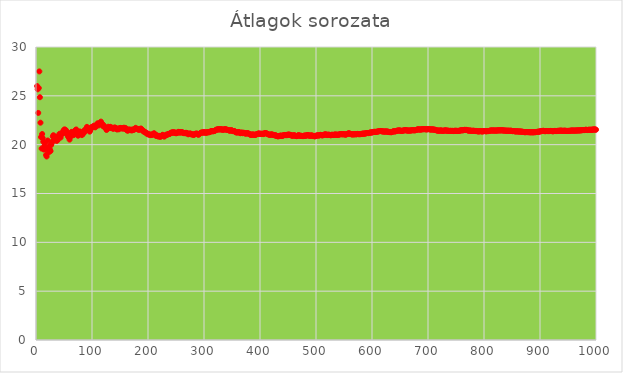
| Category | Series 0 |
|---|---|
| 1.0 | 36 |
| 2.0 | 26 |
| 3.0 | 25.667 |
| 4.0 | 23.25 |
| 5.0 | 25.8 |
| 6.0 | 27.5 |
| 7.0 | 24.857 |
| 8.0 | 22.25 |
| 9.0 | 20.778 |
| 10.0 | 19.6 |
| 11.0 | 21.091 |
| 12.0 | 20.667 |
| 13.0 | 20.308 |
| 14.0 | 19.5 |
| 15.0 | 19.867 |
| 16.0 | 20.188 |
| 17.0 | 19.529 |
| 18.0 | 18.944 |
| 19.0 | 18.789 |
| 20.0 | 19.65 |
| 21.0 | 20.429 |
| 22.0 | 19.682 |
| 23.0 | 19.217 |
| 24.0 | 19.917 |
| 25.0 | 19.48 |
| 26.0 | 19.346 |
| 27.0 | 19.963 |
| 28.0 | 20.143 |
| 29.0 | 20.31 |
| 30.0 | 20.833 |
| 31.0 | 20.968 |
| 32.0 | 20.438 |
| 33.0 | 20.576 |
| 34.0 | 20.706 |
| 35.0 | 20.829 |
| 36.0 | 20.5 |
| 37.0 | 20.378 |
| 38.0 | 20.789 |
| 39.0 | 20.487 |
| 40.0 | 20.875 |
| 41.0 | 20.756 |
| 42.0 | 21.119 |
| 43.0 | 21 |
| 44.0 | 20.727 |
| 45.0 | 21.067 |
| 46.0 | 21.152 |
| 47.0 | 21.234 |
| 48.0 | 21.125 |
| 49.0 | 21.429 |
| 50.0 | 21.5 |
| 51.0 | 21.569 |
| 52.0 | 21.231 |
| 53.0 | 21.509 |
| 54.0 | 21.407 |
| 55.0 | 21.309 |
| 56.0 | 21.089 |
| 57.0 | 20.877 |
| 58.0 | 20.793 |
| 59.0 | 20.712 |
| 60.0 | 20.517 |
| 61.0 | 20.77 |
| 62.0 | 21.016 |
| 63.0 | 21.254 |
| 64.0 | 21.312 |
| 65.0 | 21.123 |
| 66.0 | 21.045 |
| 67.0 | 20.97 |
| 68.0 | 21.029 |
| 69.0 | 21.246 |
| 70.0 | 21.457 |
| 71.0 | 21.507 |
| 72.0 | 21.556 |
| 73.0 | 21.315 |
| 74.0 | 21.081 |
| 75.0 | 20.92 |
| 76.0 | 20.974 |
| 77.0 | 21.169 |
| 78.0 | 21.359 |
| 79.0 | 21.291 |
| 80.0 | 21.138 |
| 81.0 | 21.185 |
| 82.0 | 20.976 |
| 83.0 | 21.157 |
| 84.0 | 21.095 |
| 85.0 | 21.271 |
| 86.0 | 21.442 |
| 87.0 | 21.483 |
| 88.0 | 21.341 |
| 89.0 | 21.506 |
| 90.0 | 21.667 |
| 91.0 | 21.824 |
| 92.0 | 21.63 |
| 93.0 | 21.495 |
| 94.0 | 21.649 |
| 95.0 | 21.463 |
| 96.0 | 21.333 |
| 97.0 | 21.485 |
| 98.0 | 21.633 |
| 99.0 | 21.778 |
| 100.0 | 21.81 |
| 101.0 | 21.842 |
| 102.0 | 21.873 |
| 103.0 | 21.816 |
| 104.0 | 21.952 |
| 105.0 | 21.829 |
| 106.0 | 21.774 |
| 107.0 | 21.907 |
| 108.0 | 21.935 |
| 109.0 | 22.064 |
| 110.0 | 22.191 |
| 111.0 | 22.135 |
| 112.0 | 21.973 |
| 113.0 | 22.097 |
| 114.0 | 22.123 |
| 115.0 | 22.243 |
| 116.0 | 22.362 |
| 117.0 | 22.205 |
| 118.0 | 22.153 |
| 119.0 | 21.975 |
| 120.0 | 21.867 |
| 121.0 | 21.983 |
| 122.0 | 21.836 |
| 123.0 | 21.789 |
| 124.0 | 21.742 |
| 125.0 | 21.64 |
| 126.0 | 21.5 |
| 127.0 | 21.614 |
| 128.0 | 21.727 |
| 129.0 | 21.837 |
| 130.0 | 21.738 |
| 131.0 | 21.695 |
| 132.0 | 21.803 |
| 133.0 | 21.827 |
| 134.0 | 21.731 |
| 135.0 | 21.689 |
| 136.0 | 21.713 |
| 137.0 | 21.737 |
| 138.0 | 21.609 |
| 139.0 | 21.712 |
| 140.0 | 21.736 |
| 141.0 | 21.759 |
| 142.0 | 21.718 |
| 143.0 | 21.678 |
| 144.0 | 21.59 |
| 145.0 | 21.552 |
| 146.0 | 21.651 |
| 147.0 | 21.612 |
| 148.0 | 21.574 |
| 149.0 | 21.671 |
| 150.0 | 21.693 |
| 151.0 | 21.715 |
| 152.0 | 21.678 |
| 153.0 | 21.699 |
| 154.0 | 21.662 |
| 155.0 | 21.684 |
| 156.0 | 21.647 |
| 157.0 | 21.739 |
| 158.0 | 21.658 |
| 159.0 | 21.623 |
| 160.0 | 21.712 |
| 161.0 | 21.602 |
| 162.0 | 21.494 |
| 163.0 | 21.46 |
| 164.0 | 21.427 |
| 165.0 | 21.515 |
| 166.0 | 21.536 |
| 167.0 | 21.557 |
| 168.0 | 21.482 |
| 169.0 | 21.503 |
| 170.0 | 21.524 |
| 171.0 | 21.45 |
| 172.0 | 21.535 |
| 173.0 | 21.555 |
| 174.0 | 21.523 |
| 175.0 | 21.543 |
| 176.0 | 21.562 |
| 177.0 | 21.644 |
| 178.0 | 21.725 |
| 179.0 | 21.609 |
| 180.0 | 21.628 |
| 181.0 | 21.597 |
| 182.0 | 21.615 |
| 183.0 | 21.519 |
| 184.0 | 21.538 |
| 185.0 | 21.557 |
| 186.0 | 21.575 |
| 187.0 | 21.652 |
| 188.0 | 21.622 |
| 189.0 | 21.529 |
| 190.0 | 21.5 |
| 191.0 | 21.408 |
| 192.0 | 21.344 |
| 193.0 | 21.363 |
| 194.0 | 21.299 |
| 195.0 | 21.272 |
| 196.0 | 21.245 |
| 197.0 | 21.157 |
| 198.0 | 21.131 |
| 199.0 | 21.151 |
| 200.0 | 21.09 |
| 201.0 | 21.03 |
| 202.0 | 21.05 |
| 203.0 | 21.025 |
| 204.0 | 21 |
| 205.0 | 20.976 |
| 206.0 | 21.049 |
| 207.0 | 21.024 |
| 208.0 | 21 |
| 209.0 | 21.072 |
| 210.0 | 21.143 |
| 211.0 | 21.161 |
| 212.0 | 21.104 |
| 213.0 | 21.009 |
| 214.0 | 20.916 |
| 215.0 | 20.893 |
| 216.0 | 20.963 |
| 217.0 | 20.908 |
| 218.0 | 20.853 |
| 219.0 | 20.831 |
| 220.0 | 20.9 |
| 221.0 | 20.846 |
| 222.0 | 20.793 |
| 223.0 | 20.861 |
| 224.0 | 20.879 |
| 225.0 | 20.947 |
| 226.0 | 21.013 |
| 227.0 | 20.96 |
| 228.0 | 20.873 |
| 229.0 | 20.821 |
| 230.0 | 20.887 |
| 231.0 | 20.952 |
| 232.0 | 20.97 |
| 233.0 | 21.034 |
| 234.0 | 21.013 |
| 235.0 | 21.03 |
| 236.0 | 21.093 |
| 237.0 | 21.11 |
| 238.0 | 21.088 |
| 239.0 | 21.105 |
| 240.0 | 21.167 |
| 241.0 | 21.228 |
| 242.0 | 21.207 |
| 243.0 | 21.267 |
| 244.0 | 21.217 |
| 245.0 | 21.278 |
| 246.0 | 21.228 |
| 247.0 | 21.243 |
| 248.0 | 21.258 |
| 249.0 | 21.189 |
| 250.0 | 21.168 |
| 251.0 | 21.183 |
| 252.0 | 21.198 |
| 253.0 | 21.257 |
| 254.0 | 21.315 |
| 255.0 | 21.267 |
| 256.0 | 21.246 |
| 257.0 | 21.304 |
| 258.0 | 21.225 |
| 259.0 | 21.282 |
| 260.0 | 21.296 |
| 261.0 | 21.249 |
| 262.0 | 21.263 |
| 263.0 | 21.198 |
| 264.0 | 21.178 |
| 265.0 | 21.192 |
| 266.0 | 21.207 |
| 267.0 | 21.161 |
| 268.0 | 21.216 |
| 269.0 | 21.171 |
| 270.0 | 21.185 |
| 271.0 | 21.122 |
| 272.0 | 21.059 |
| 273.0 | 21.114 |
| 274.0 | 21.095 |
| 275.0 | 21.149 |
| 276.0 | 21.13 |
| 277.0 | 21.058 |
| 278.0 | 21.072 |
| 279.0 | 21.054 |
| 280.0 | 21.036 |
| 281.0 | 21.018 |
| 282.0 | 21 |
| 283.0 | 21.053 |
| 284.0 | 21.106 |
| 285.0 | 21.119 |
| 286.0 | 21.101 |
| 287.0 | 21.153 |
| 288.0 | 21.094 |
| 289.0 | 21.052 |
| 290.0 | 21.01 |
| 291.0 | 21.062 |
| 292.0 | 21.113 |
| 293.0 | 21.164 |
| 294.0 | 21.214 |
| 295.0 | 21.227 |
| 296.0 | 21.24 |
| 297.0 | 21.253 |
| 298.0 | 21.235 |
| 299.0 | 21.284 |
| 300.0 | 21.227 |
| 301.0 | 21.276 |
| 302.0 | 21.258 |
| 303.0 | 21.218 |
| 304.0 | 21.23 |
| 305.0 | 21.243 |
| 306.0 | 21.255 |
| 307.0 | 21.303 |
| 308.0 | 21.263 |
| 309.0 | 21.275 |
| 310.0 | 21.287 |
| 311.0 | 21.334 |
| 312.0 | 21.346 |
| 313.0 | 21.393 |
| 314.0 | 21.376 |
| 315.0 | 21.387 |
| 316.0 | 21.37 |
| 317.0 | 21.382 |
| 318.0 | 21.393 |
| 319.0 | 21.404 |
| 320.0 | 21.45 |
| 321.0 | 21.495 |
| 322.0 | 21.54 |
| 323.0 | 21.523 |
| 324.0 | 21.568 |
| 325.0 | 21.578 |
| 326.0 | 21.561 |
| 327.0 | 21.572 |
| 328.0 | 21.555 |
| 329.0 | 21.599 |
| 330.0 | 21.561 |
| 331.0 | 21.571 |
| 332.0 | 21.554 |
| 333.0 | 21.538 |
| 334.0 | 21.521 |
| 335.0 | 21.564 |
| 336.0 | 21.548 |
| 337.0 | 21.558 |
| 338.0 | 21.601 |
| 339.0 | 21.563 |
| 340.0 | 21.526 |
| 341.0 | 21.537 |
| 342.0 | 21.52 |
| 343.0 | 21.504 |
| 344.0 | 21.488 |
| 345.0 | 21.438 |
| 346.0 | 21.448 |
| 347.0 | 21.432 |
| 348.0 | 21.474 |
| 349.0 | 21.484 |
| 350.0 | 21.449 |
| 351.0 | 21.413 |
| 352.0 | 21.378 |
| 353.0 | 21.388 |
| 354.0 | 21.398 |
| 355.0 | 21.363 |
| 356.0 | 21.315 |
| 357.0 | 21.266 |
| 358.0 | 21.251 |
| 359.0 | 21.262 |
| 360.0 | 21.247 |
| 361.0 | 21.288 |
| 362.0 | 21.298 |
| 363.0 | 21.251 |
| 364.0 | 21.217 |
| 365.0 | 21.17 |
| 366.0 | 21.21 |
| 367.0 | 21.251 |
| 368.0 | 21.217 |
| 369.0 | 21.171 |
| 370.0 | 21.211 |
| 371.0 | 21.221 |
| 372.0 | 21.188 |
| 373.0 | 21.155 |
| 374.0 | 21.142 |
| 375.0 | 21.152 |
| 376.0 | 21.138 |
| 377.0 | 21.178 |
| 378.0 | 21.188 |
| 379.0 | 21.142 |
| 380.0 | 21.129 |
| 381.0 | 21.084 |
| 382.0 | 21.039 |
| 383.0 | 21.026 |
| 384.0 | 20.995 |
| 385.0 | 21.034 |
| 386.0 | 21.021 |
| 387.0 | 21.059 |
| 388.0 | 21.008 |
| 389.0 | 21.018 |
| 390.0 | 21.028 |
| 391.0 | 20.985 |
| 392.0 | 21.023 |
| 393.0 | 21.033 |
| 394.0 | 21.071 |
| 395.0 | 21.081 |
| 396.0 | 21.119 |
| 397.0 | 21.128 |
| 398.0 | 21.138 |
| 399.0 | 21.148 |
| 400.0 | 21.098 |
| 401.0 | 21.107 |
| 402.0 | 21.117 |
| 403.0 | 21.104 |
| 404.0 | 21.114 |
| 405.0 | 21.123 |
| 406.0 | 21.081 |
| 407.0 | 21.118 |
| 408.0 | 21.154 |
| 409.0 | 21.191 |
| 410.0 | 21.178 |
| 411.0 | 21.148 |
| 412.0 | 21.158 |
| 413.0 | 21.116 |
| 414.0 | 21.068 |
| 415.0 | 21.055 |
| 416.0 | 21.043 |
| 417.0 | 21.002 |
| 418.0 | 21.012 |
| 419.0 | 21.021 |
| 420.0 | 21.057 |
| 421.0 | 21.045 |
| 422.0 | 21.017 |
| 423.0 | 21.026 |
| 424.0 | 20.986 |
| 425.0 | 20.974 |
| 426.0 | 20.962 |
| 427.0 | 20.934 |
| 428.0 | 20.97 |
| 429.0 | 20.923 |
| 430.0 | 20.884 |
| 431.0 | 20.872 |
| 432.0 | 20.845 |
| 433.0 | 20.88 |
| 434.0 | 20.869 |
| 435.0 | 20.903 |
| 436.0 | 20.913 |
| 437.0 | 20.922 |
| 438.0 | 20.932 |
| 439.0 | 20.893 |
| 440.0 | 20.902 |
| 441.0 | 20.937 |
| 442.0 | 20.971 |
| 443.0 | 20.959 |
| 444.0 | 20.993 |
| 445.0 | 20.982 |
| 446.0 | 20.971 |
| 447.0 | 21.004 |
| 448.0 | 20.967 |
| 449.0 | 21 |
| 450.0 | 21.033 |
| 451.0 | 21.022 |
| 452.0 | 21.031 |
| 453.0 | 21.004 |
| 454.0 | 21.013 |
| 455.0 | 20.987 |
| 456.0 | 20.95 |
| 457.0 | 20.912 |
| 458.0 | 20.921 |
| 459.0 | 20.93 |
| 460.0 | 20.963 |
| 461.0 | 20.926 |
| 462.0 | 20.959 |
| 463.0 | 20.922 |
| 464.0 | 20.897 |
| 465.0 | 20.871 |
| 466.0 | 20.88 |
| 467.0 | 20.912 |
| 468.0 | 20.944 |
| 469.0 | 20.977 |
| 470.0 | 20.94 |
| 471.0 | 20.915 |
| 472.0 | 20.905 |
| 473.0 | 20.913 |
| 474.0 | 20.903 |
| 475.0 | 20.893 |
| 476.0 | 20.882 |
| 477.0 | 20.872 |
| 478.0 | 20.904 |
| 479.0 | 20.912 |
| 480.0 | 20.944 |
| 481.0 | 20.919 |
| 482.0 | 20.909 |
| 483.0 | 20.94 |
| 484.0 | 20.971 |
| 485.0 | 20.961 |
| 486.0 | 20.992 |
| 487.0 | 20.951 |
| 488.0 | 20.926 |
| 489.0 | 20.892 |
| 490.0 | 20.922 |
| 491.0 | 20.953 |
| 492.0 | 20.943 |
| 493.0 | 20.933 |
| 494.0 | 20.909 |
| 495.0 | 20.875 |
| 496.0 | 20.905 |
| 497.0 | 20.871 |
| 498.0 | 20.847 |
| 499.0 | 20.878 |
| 500.0 | 20.908 |
| 501.0 | 20.938 |
| 502.0 | 20.928 |
| 503.0 | 20.958 |
| 504.0 | 20.948 |
| 505.0 | 20.939 |
| 506.0 | 20.947 |
| 507.0 | 20.976 |
| 508.0 | 21.006 |
| 509.0 | 20.982 |
| 510.0 | 20.973 |
| 511.0 | 20.949 |
| 512.0 | 20.957 |
| 513.0 | 20.986 |
| 514.0 | 21.016 |
| 515.0 | 21.023 |
| 516.0 | 21.052 |
| 517.0 | 21.06 |
| 518.0 | 21.037 |
| 519.0 | 21.004 |
| 520.0 | 20.981 |
| 521.0 | 21.01 |
| 522.0 | 21.038 |
| 523.0 | 21 |
| 524.0 | 21.008 |
| 525.0 | 20.985 |
| 526.0 | 20.962 |
| 527.0 | 20.97 |
| 528.0 | 20.998 |
| 529.0 | 21.026 |
| 530.0 | 20.994 |
| 531.0 | 20.985 |
| 532.0 | 21.013 |
| 533.0 | 21.021 |
| 534.0 | 21.049 |
| 535.0 | 21.026 |
| 536.0 | 21.017 |
| 537.0 | 21.007 |
| 538.0 | 21.035 |
| 539.0 | 21.013 |
| 540.0 | 21.004 |
| 541.0 | 21.031 |
| 542.0 | 21.059 |
| 543.0 | 21.066 |
| 544.0 | 21.074 |
| 545.0 | 21.064 |
| 546.0 | 21.092 |
| 547.0 | 21.06 |
| 548.0 | 21.068 |
| 549.0 | 21.058 |
| 550.0 | 21.065 |
| 551.0 | 21.073 |
| 552.0 | 21.042 |
| 553.0 | 21.02 |
| 554.0 | 21.047 |
| 555.0 | 21.074 |
| 556.0 | 21.101 |
| 557.0 | 21.127 |
| 558.0 | 21.154 |
| 559.0 | 21.161 |
| 560.0 | 21.139 |
| 561.0 | 21.109 |
| 562.0 | 21.087 |
| 563.0 | 21.078 |
| 564.0 | 21.043 |
| 565.0 | 21.05 |
| 566.0 | 21.076 |
| 567.0 | 21.055 |
| 568.0 | 21.046 |
| 569.0 | 21.072 |
| 570.0 | 21.098 |
| 571.0 | 21.063 |
| 572.0 | 21.054 |
| 573.0 | 21.08 |
| 574.0 | 21.106 |
| 575.0 | 21.097 |
| 576.0 | 21.068 |
| 577.0 | 21.094 |
| 578.0 | 21.064 |
| 579.0 | 21.09 |
| 580.0 | 21.081 |
| 581.0 | 21.107 |
| 582.0 | 21.098 |
| 583.0 | 21.123 |
| 584.0 | 21.13 |
| 585.0 | 21.137 |
| 586.0 | 21.116 |
| 587.0 | 21.141 |
| 588.0 | 21.148 |
| 589.0 | 21.154 |
| 590.0 | 21.18 |
| 591.0 | 21.186 |
| 592.0 | 21.193 |
| 593.0 | 21.199 |
| 594.0 | 21.178 |
| 595.0 | 21.203 |
| 596.0 | 21.228 |
| 597.0 | 21.253 |
| 598.0 | 21.244 |
| 599.0 | 21.235 |
| 600.0 | 21.26 |
| 601.0 | 21.266 |
| 602.0 | 21.291 |
| 603.0 | 21.297 |
| 604.0 | 21.321 |
| 605.0 | 21.312 |
| 606.0 | 21.292 |
| 607.0 | 21.316 |
| 608.0 | 21.322 |
| 609.0 | 21.328 |
| 610.0 | 21.334 |
| 611.0 | 21.358 |
| 612.0 | 21.364 |
| 613.0 | 21.388 |
| 614.0 | 21.394 |
| 615.0 | 21.4 |
| 616.0 | 21.391 |
| 617.0 | 21.371 |
| 618.0 | 21.362 |
| 619.0 | 21.368 |
| 620.0 | 21.348 |
| 621.0 | 21.34 |
| 622.0 | 21.346 |
| 623.0 | 21.337 |
| 624.0 | 21.343 |
| 625.0 | 21.349 |
| 626.0 | 21.355 |
| 627.0 | 21.322 |
| 628.0 | 21.346 |
| 629.0 | 21.318 |
| 630.0 | 21.29 |
| 631.0 | 21.282 |
| 632.0 | 21.305 |
| 633.0 | 21.297 |
| 634.0 | 21.265 |
| 635.0 | 21.288 |
| 636.0 | 21.311 |
| 637.0 | 21.334 |
| 638.0 | 21.357 |
| 639.0 | 21.38 |
| 640.0 | 21.372 |
| 641.0 | 21.345 |
| 642.0 | 21.368 |
| 643.0 | 21.39 |
| 644.0 | 21.413 |
| 645.0 | 21.436 |
| 646.0 | 21.441 |
| 647.0 | 21.447 |
| 648.0 | 21.452 |
| 649.0 | 21.458 |
| 650.0 | 21.449 |
| 651.0 | 21.43 |
| 652.0 | 21.411 |
| 653.0 | 21.417 |
| 654.0 | 21.422 |
| 655.0 | 21.427 |
| 656.0 | 21.45 |
| 657.0 | 21.455 |
| 658.0 | 21.477 |
| 659.0 | 21.483 |
| 660.0 | 21.474 |
| 661.0 | 21.48 |
| 662.0 | 21.453 |
| 663.0 | 21.459 |
| 664.0 | 21.432 |
| 665.0 | 21.454 |
| 666.0 | 21.435 |
| 667.0 | 21.441 |
| 668.0 | 21.446 |
| 669.0 | 21.451 |
| 670.0 | 21.457 |
| 671.0 | 21.478 |
| 672.0 | 21.47 |
| 673.0 | 21.492 |
| 674.0 | 21.473 |
| 675.0 | 21.479 |
| 676.0 | 21.46 |
| 677.0 | 21.482 |
| 678.0 | 21.487 |
| 679.0 | 21.508 |
| 680.0 | 21.529 |
| 681.0 | 21.551 |
| 682.0 | 21.572 |
| 683.0 | 21.564 |
| 684.0 | 21.545 |
| 685.0 | 21.566 |
| 686.0 | 21.548 |
| 687.0 | 21.54 |
| 688.0 | 21.561 |
| 689.0 | 21.582 |
| 690.0 | 21.574 |
| 691.0 | 21.579 |
| 692.0 | 21.584 |
| 693.0 | 21.589 |
| 694.0 | 21.594 |
| 695.0 | 21.576 |
| 696.0 | 21.58 |
| 697.0 | 21.562 |
| 698.0 | 21.567 |
| 699.0 | 21.572 |
| 700.0 | 21.593 |
| 701.0 | 21.598 |
| 702.0 | 21.58 |
| 703.0 | 21.585 |
| 704.0 | 21.56 |
| 705.0 | 21.542 |
| 706.0 | 21.547 |
| 707.0 | 21.567 |
| 708.0 | 21.572 |
| 709.0 | 21.554 |
| 710.0 | 21.53 |
| 711.0 | 21.55 |
| 712.0 | 21.532 |
| 713.0 | 21.515 |
| 714.0 | 21.49 |
| 715.0 | 21.473 |
| 716.0 | 21.448 |
| 717.0 | 21.441 |
| 718.0 | 21.446 |
| 719.0 | 21.428 |
| 720.0 | 21.449 |
| 721.0 | 21.424 |
| 722.0 | 21.445 |
| 723.0 | 21.465 |
| 724.0 | 21.441 |
| 725.0 | 21.433 |
| 726.0 | 21.416 |
| 727.0 | 21.421 |
| 728.0 | 21.426 |
| 729.0 | 21.446 |
| 730.0 | 21.451 |
| 731.0 | 21.471 |
| 732.0 | 21.447 |
| 733.0 | 21.452 |
| 734.0 | 21.424 |
| 735.0 | 21.429 |
| 736.0 | 21.433 |
| 737.0 | 21.417 |
| 738.0 | 21.4 |
| 739.0 | 21.419 |
| 740.0 | 21.412 |
| 741.0 | 21.417 |
| 742.0 | 21.41 |
| 743.0 | 21.402 |
| 744.0 | 21.422 |
| 745.0 | 21.399 |
| 746.0 | 21.391 |
| 747.0 | 21.411 |
| 748.0 | 21.43 |
| 749.0 | 21.414 |
| 750.0 | 21.419 |
| 751.0 | 21.423 |
| 752.0 | 21.407 |
| 753.0 | 21.4 |
| 754.0 | 21.419 |
| 755.0 | 21.403 |
| 756.0 | 21.422 |
| 757.0 | 21.441 |
| 758.0 | 21.46 |
| 759.0 | 21.465 |
| 760.0 | 21.484 |
| 761.0 | 21.468 |
| 762.0 | 21.472 |
| 763.0 | 21.477 |
| 764.0 | 21.496 |
| 765.0 | 21.515 |
| 766.0 | 21.52 |
| 767.0 | 21.497 |
| 768.0 | 21.516 |
| 769.0 | 21.508 |
| 770.0 | 21.486 |
| 771.0 | 21.463 |
| 772.0 | 21.447 |
| 773.0 | 21.431 |
| 774.0 | 21.45 |
| 775.0 | 21.443 |
| 776.0 | 21.436 |
| 777.0 | 21.429 |
| 778.0 | 21.406 |
| 779.0 | 21.411 |
| 780.0 | 21.429 |
| 781.0 | 21.423 |
| 782.0 | 21.416 |
| 783.0 | 21.409 |
| 784.0 | 21.413 |
| 785.0 | 21.391 |
| 786.0 | 21.41 |
| 787.0 | 21.388 |
| 788.0 | 21.381 |
| 789.0 | 21.374 |
| 790.0 | 21.348 |
| 791.0 | 21.367 |
| 792.0 | 21.371 |
| 793.0 | 21.39 |
| 794.0 | 21.383 |
| 795.0 | 21.367 |
| 796.0 | 21.372 |
| 797.0 | 21.346 |
| 798.0 | 21.365 |
| 799.0 | 21.383 |
| 800.0 | 21.388 |
| 801.0 | 21.392 |
| 802.0 | 21.385 |
| 803.0 | 21.379 |
| 804.0 | 21.363 |
| 805.0 | 21.381 |
| 806.0 | 21.4 |
| 807.0 | 21.378 |
| 808.0 | 21.396 |
| 809.0 | 21.4 |
| 810.0 | 21.419 |
| 811.0 | 21.436 |
| 812.0 | 21.454 |
| 813.0 | 21.448 |
| 814.0 | 21.452 |
| 815.0 | 21.456 |
| 816.0 | 21.45 |
| 817.0 | 21.435 |
| 818.0 | 21.452 |
| 819.0 | 21.457 |
| 820.0 | 21.435 |
| 821.0 | 21.44 |
| 822.0 | 21.457 |
| 823.0 | 21.436 |
| 824.0 | 21.454 |
| 825.0 | 21.472 |
| 826.0 | 21.45 |
| 827.0 | 21.468 |
| 828.0 | 21.461 |
| 829.0 | 21.479 |
| 830.0 | 21.464 |
| 831.0 | 21.457 |
| 832.0 | 21.475 |
| 833.0 | 21.479 |
| 834.0 | 21.458 |
| 835.0 | 21.434 |
| 836.0 | 21.451 |
| 837.0 | 21.444 |
| 838.0 | 21.449 |
| 839.0 | 21.428 |
| 840.0 | 21.421 |
| 841.0 | 21.426 |
| 842.0 | 21.443 |
| 843.0 | 21.422 |
| 844.0 | 21.427 |
| 845.0 | 21.42 |
| 846.0 | 21.424 |
| 847.0 | 21.418 |
| 848.0 | 21.435 |
| 849.0 | 21.42 |
| 850.0 | 21.4 |
| 851.0 | 21.376 |
| 852.0 | 21.393 |
| 853.0 | 21.397 |
| 854.0 | 21.383 |
| 855.0 | 21.368 |
| 856.0 | 21.362 |
| 857.0 | 21.348 |
| 858.0 | 21.365 |
| 859.0 | 21.369 |
| 860.0 | 21.363 |
| 861.0 | 21.357 |
| 862.0 | 21.333 |
| 863.0 | 21.35 |
| 864.0 | 21.354 |
| 865.0 | 21.348 |
| 866.0 | 21.328 |
| 867.0 | 21.322 |
| 868.0 | 21.339 |
| 869.0 | 21.319 |
| 870.0 | 21.299 |
| 871.0 | 21.303 |
| 872.0 | 21.289 |
| 873.0 | 21.266 |
| 874.0 | 21.283 |
| 875.0 | 21.299 |
| 876.0 | 21.285 |
| 877.0 | 21.29 |
| 878.0 | 21.284 |
| 879.0 | 21.278 |
| 880.0 | 21.282 |
| 881.0 | 21.276 |
| 882.0 | 21.262 |
| 883.0 | 21.279 |
| 884.0 | 21.265 |
| 885.0 | 21.269 |
| 886.0 | 21.273 |
| 887.0 | 21.277 |
| 888.0 | 21.255 |
| 889.0 | 21.271 |
| 890.0 | 21.288 |
| 891.0 | 21.274 |
| 892.0 | 21.278 |
| 893.0 | 21.295 |
| 894.0 | 21.299 |
| 895.0 | 21.315 |
| 896.0 | 21.331 |
| 897.0 | 21.312 |
| 898.0 | 21.329 |
| 899.0 | 21.345 |
| 900.0 | 21.361 |
| 901.0 | 21.377 |
| 902.0 | 21.371 |
| 903.0 | 21.388 |
| 904.0 | 21.404 |
| 905.0 | 21.408 |
| 906.0 | 21.424 |
| 907.0 | 21.41 |
| 908.0 | 21.391 |
| 909.0 | 21.377 |
| 910.0 | 21.381 |
| 911.0 | 21.397 |
| 912.0 | 21.401 |
| 913.0 | 21.388 |
| 914.0 | 21.392 |
| 915.0 | 21.386 |
| 916.0 | 21.402 |
| 917.0 | 21.388 |
| 918.0 | 21.392 |
| 919.0 | 21.408 |
| 920.0 | 21.402 |
| 921.0 | 21.396 |
| 922.0 | 21.377 |
| 923.0 | 21.372 |
| 924.0 | 21.376 |
| 925.0 | 21.391 |
| 926.0 | 21.407 |
| 927.0 | 21.411 |
| 928.0 | 21.392 |
| 929.0 | 21.396 |
| 930.0 | 21.39 |
| 931.0 | 21.406 |
| 932.0 | 21.422 |
| 933.0 | 21.408 |
| 934.0 | 21.424 |
| 935.0 | 21.428 |
| 936.0 | 21.432 |
| 937.0 | 21.435 |
| 938.0 | 21.43 |
| 939.0 | 21.433 |
| 940.0 | 21.415 |
| 941.0 | 21.409 |
| 942.0 | 21.425 |
| 943.0 | 21.428 |
| 944.0 | 21.432 |
| 945.0 | 21.419 |
| 946.0 | 21.423 |
| 947.0 | 21.404 |
| 948.0 | 21.408 |
| 949.0 | 21.412 |
| 950.0 | 21.399 |
| 951.0 | 21.414 |
| 952.0 | 21.418 |
| 953.0 | 21.412 |
| 954.0 | 21.428 |
| 955.0 | 21.443 |
| 956.0 | 21.437 |
| 957.0 | 21.441 |
| 958.0 | 21.456 |
| 959.0 | 21.438 |
| 960.0 | 21.442 |
| 961.0 | 21.436 |
| 962.0 | 21.44 |
| 963.0 | 21.443 |
| 964.0 | 21.447 |
| 965.0 | 21.451 |
| 966.0 | 21.445 |
| 967.0 | 21.46 |
| 968.0 | 21.464 |
| 969.0 | 21.451 |
| 970.0 | 21.455 |
| 971.0 | 21.47 |
| 972.0 | 21.464 |
| 973.0 | 21.479 |
| 974.0 | 21.466 |
| 975.0 | 21.481 |
| 976.0 | 21.496 |
| 977.0 | 21.499 |
| 978.0 | 21.494 |
| 979.0 | 21.488 |
| 980.0 | 21.503 |
| 981.0 | 21.518 |
| 982.0 | 21.533 |
| 983.0 | 21.515 |
| 984.0 | 21.509 |
| 985.0 | 21.496 |
| 986.0 | 21.511 |
| 987.0 | 21.526 |
| 988.0 | 21.529 |
| 989.0 | 21.512 |
| 990.0 | 21.526 |
| 991.0 | 21.53 |
| 992.0 | 21.533 |
| 993.0 | 21.528 |
| 994.0 | 21.531 |
| 995.0 | 21.546 |
| 996.0 | 21.56 |
| 997.0 | 21.564 |
| 998.0 | 21.546 |
| 999.0 | 21.55 |
| 1000.0 | 21.532 |